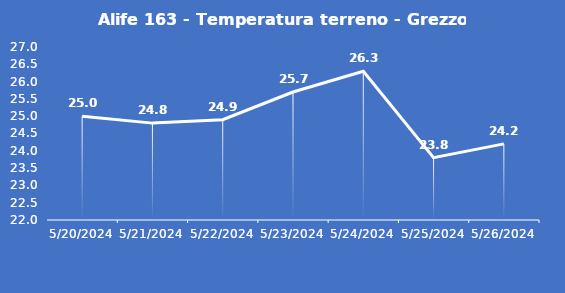
| Category | Alife 163 - Temperatura terreno - Grezzo (°C) |
|---|---|
| 5/20/24 | 25 |
| 5/21/24 | 24.8 |
| 5/22/24 | 24.9 |
| 5/23/24 | 25.7 |
| 5/24/24 | 26.3 |
| 5/25/24 | 23.8 |
| 5/26/24 | 24.2 |